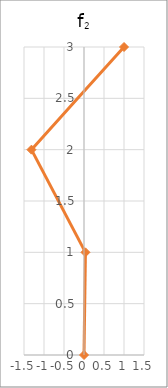
| Category | f2 |
|---|---|
| 0.0 | 0 |
| 0.03591063240840464 | 1 |
| -1.313782464421782 | 2 |
| 1.0 | 3 |